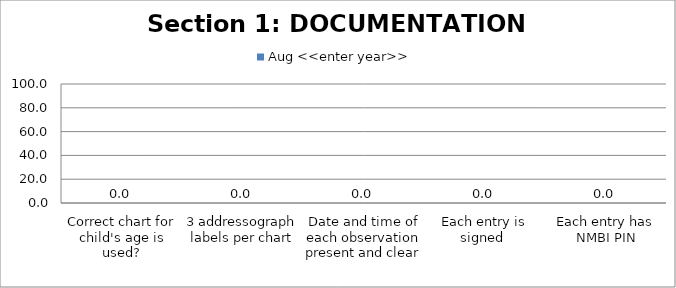
| Category | Aug <<enter year>> |
|---|---|
| Correct chart for child's age is used? | 0 |
| 3 addressograph labels per chart | 0 |
| Date and time of each observation present and clear  | 0 |
| Each entry is signed  | 0 |
| Each entry has NMBI PIN | 0 |